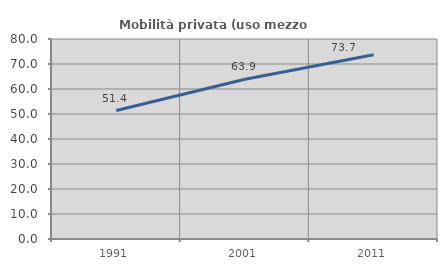
| Category | Mobilità privata (uso mezzo privato) |
|---|---|
| 1991.0 | 51.386 |
| 2001.0 | 63.896 |
| 2011.0 | 73.733 |